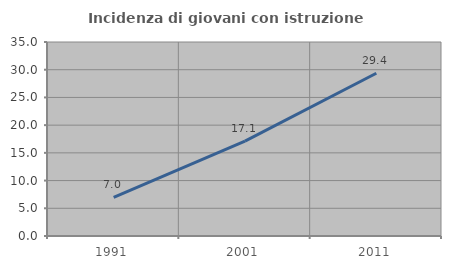
| Category | Incidenza di giovani con istruzione universitaria |
|---|---|
| 1991.0 | 6.957 |
| 2001.0 | 17.105 |
| 2011.0 | 29.358 |